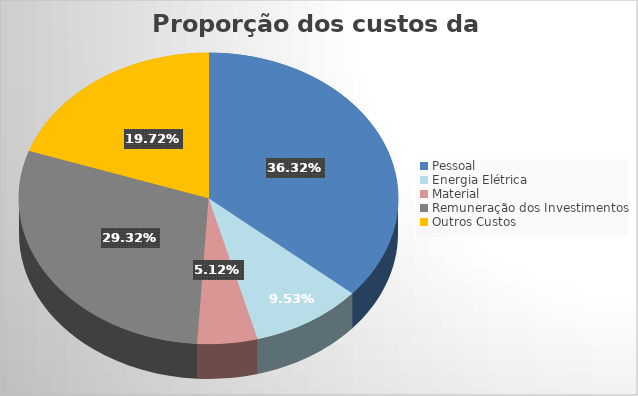
| Category | Series 0 |
|---|---|
| Pessoal | 548966485.509 |
| Energia Elétrica | 143986385.84 |
| Material  | 77387004.115 |
| Remuneração dos Investimentos | 443181040.938 |
| Outros Custos | 298091415.302 |